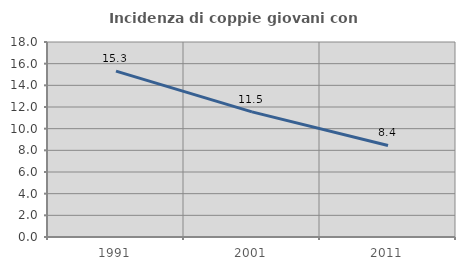
| Category | Incidenza di coppie giovani con figli |
|---|---|
| 1991.0 | 15.315 |
| 2001.0 | 11.549 |
| 2011.0 | 8.447 |